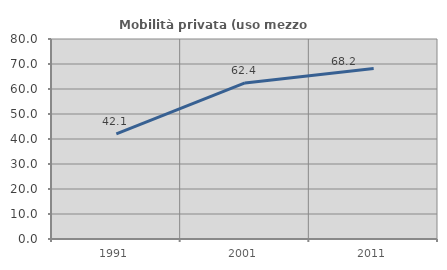
| Category | Mobilità privata (uso mezzo privato) |
|---|---|
| 1991.0 | 42.057 |
| 2001.0 | 62.409 |
| 2011.0 | 68.206 |